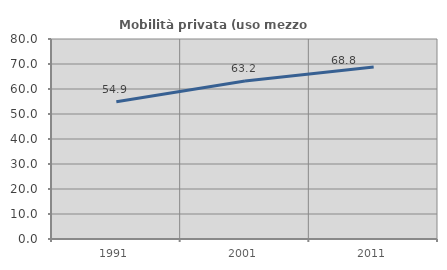
| Category | Mobilità privata (uso mezzo privato) |
|---|---|
| 1991.0 | 54.86 |
| 2001.0 | 63.18 |
| 2011.0 | 68.77 |